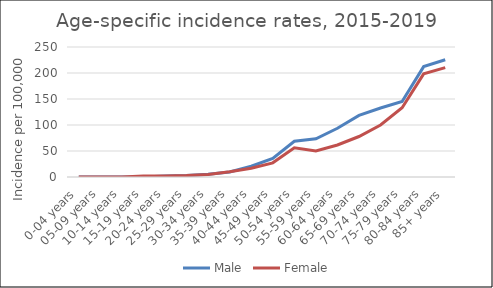
| Category | Male | Female |
|---|---|---|
| 0-04 years | 0 | 0 |
| 05-09 years | 0 | 0 |
| 10-14 years | 0 | 0 |
| 15-19 years | 0 | 1.91 |
| 20-24 years | 1.72 | 2.16 |
| 25-29 years | 2.83 | 2.93 |
| 30-34 years | 5.23 | 4.95 |
| 35-39 years | 9.65 | 9.95 |
| 40-44 years | 20.77 | 16.83 |
| 45-49 years | 35.63 | 27.22 |
| 50-54 years | 68.63 | 56.3 |
| 55-59 years | 73.45 | 49.9 |
| 60-64 years | 93.67 | 61.51 |
| 65-69 years | 118.44 | 77.86 |
| 70-74 years | 132.74 | 100.04 |
| 75-79 years | 145.16 | 133.25 |
| 80-84 years | 212.3 | 198.34 |
| 85+ years | 225.4 | 210.4 |